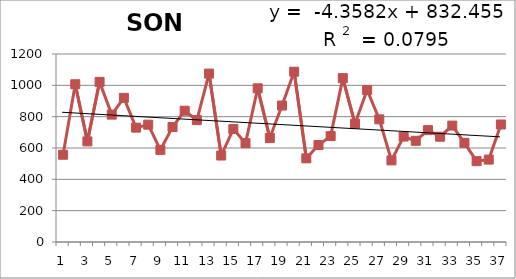
| Category | 1976-2012 |
|---|---|
| 0 | 557 |
| 1 | 1007 |
| 2 | 642 |
| 3 | 1022 |
| 4 | 813 |
| 5 | 920 |
| 6 | 730 |
| 7 | 749 |
| 8 | 588 |
| 9 | 734 |
| 10 | 838 |
| 11 | 778 |
| 12 | 1075 |
| 13 | 552 |
| 14 | 721 |
| 15 | 631 |
| 16 | 981 |
| 17 | 664 |
| 18 | 871 |
| 19 | 1087 |
| 20 | 534 |
| 21 | 619 |
| 22 | 676 |
| 23 | 1046 |
| 24 | 755 |
| 25 | 970 |
| 26 | 783 |
| 27 | 521 |
| 28 | 673 |
| 29 | 646 |
| 30 | 714 |
| 31 | 672 |
| 32 | 743 |
| 33 | 633 |
| 34 | 516 |
| 35 | 526 |
| 36 | 750 |